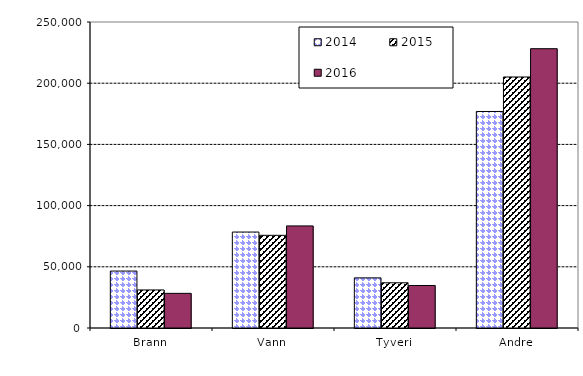
| Category | 2014 | 2015 | 2016 |
|---|---|---|---|
| Brann | 46530 | 31084.432 | 28310.174 |
| Vann | 78404 | 75724.329 | 83401.905 |
| Tyveri | 40957 | 36932.784 | 34730.615 |
| Andre | 176904 | 205070.17 | 228188.293 |